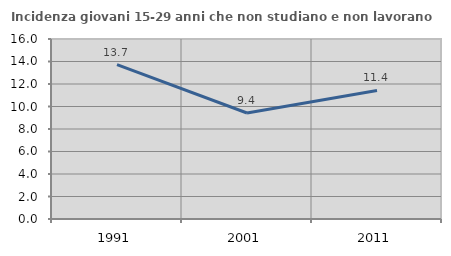
| Category | Incidenza giovani 15-29 anni che non studiano e non lavorano  |
|---|---|
| 1991.0 | 13.722 |
| 2001.0 | 9.421 |
| 2011.0 | 11.43 |